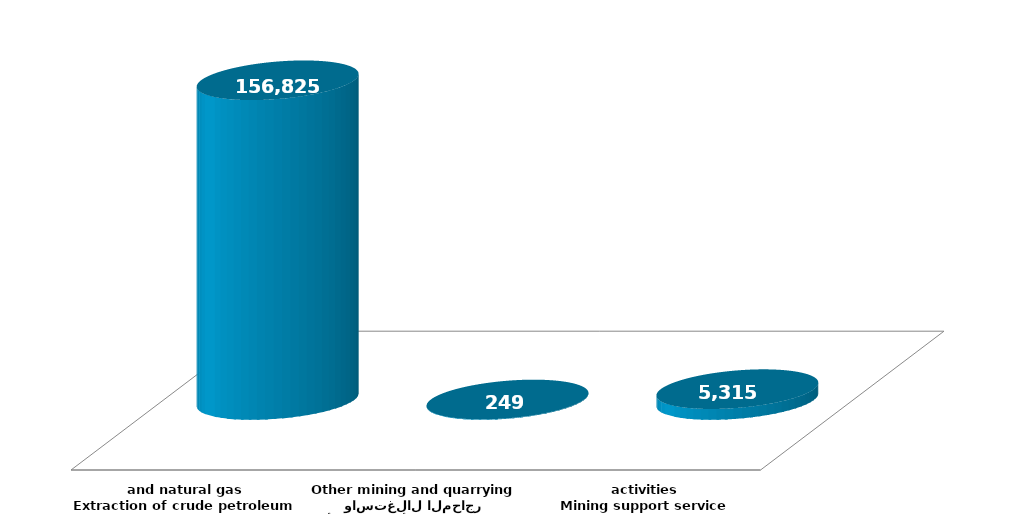
| Category | Series 1 |
|---|---|
| استخراج النفط الخام والغاز الطبيعي
Extraction of crude petroleum and natural gas | 156824559 |
| الأنشطة الأخرى للتعدين واستغلال المحاجر
Other mining and quarrying | 249336 |
| انشطة خدمات دعم التعدين
Mining support service activities | 5315036 |